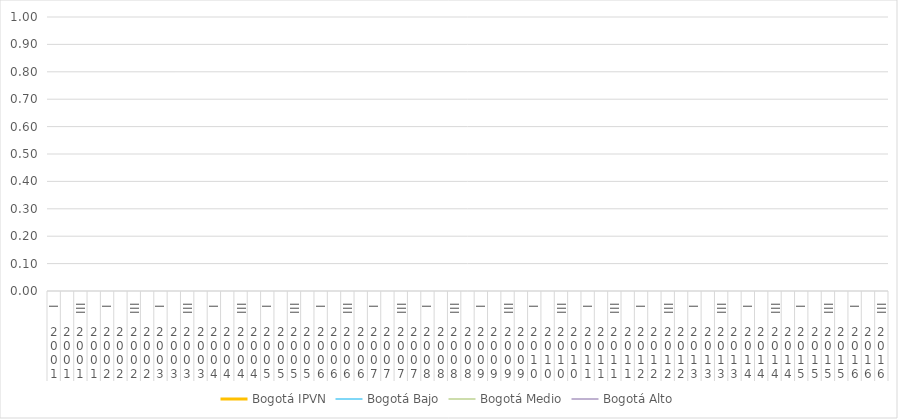
| Category | Bogotá |
|---|---|
| 0 | 0 |
| 1 | 0 |
| 2 | 0 |
| 3 | 0 |
| 4 | 0 |
| 5 | 0 |
| 6 | 0 |
| 7 | 0 |
| 8 | 0 |
| 9 | 0 |
| 10 | 0 |
| 11 | 0 |
| 12 | 0 |
| 13 | 0 |
| 14 | 0 |
| 15 | 0 |
| 16 | 0 |
| 17 | 0 |
| 18 | 0 |
| 19 | 0 |
| 20 | 0 |
| 21 | 0 |
| 22 | 0 |
| 23 | 0 |
| 24 | 0 |
| 25 | 0 |
| 26 | 0 |
| 27 | 0 |
| 28 | 0 |
| 29 | 0 |
| 30 | 0 |
| 31 | 0 |
| 32 | 0 |
| 33 | 0 |
| 34 | 0 |
| 35 | 0 |
| 36 | 0 |
| 37 | 0 |
| 38 | 0 |
| 39 | 0 |
| 40 | 0 |
| 41 | 0 |
| 42 | 0 |
| 43 | 0 |
| 44 | 0 |
| 45 | 0 |
| 46 | 0 |
| 47 | 0 |
| 48 | 0 |
| 49 | 0 |
| 50 | 0 |
| 51 | 0 |
| 52 | 0 |
| 53 | 0 |
| 54 | 0 |
| 55 | 0 |
| 56 | 0 |
| 57 | 0 |
| 58 | 0 |
| 59 | 0 |
| 60 | 0 |
| 61 | 0 |
| 62 | 0 |